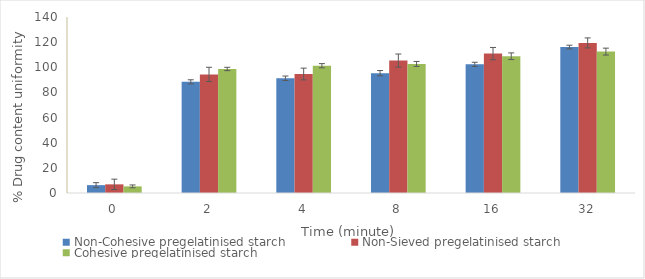
| Category | Non-Cohesive pregelatinised starch | Non-Sieved pregelatinised starch | Cohesive pregelatinised starch |
|---|---|---|---|
| 0.0 | 6.25 | 6.88 | 5.28 |
| 2.0 | 88.4 | 94.34 | 98.66 |
| 4.0 | 91.26 | 94.67 | 101.24 |
| 8.0 | 95.33 | 105.33 | 102.68 |
| 16.0 | 102.34 | 110.88 | 108.79 |
| 32.0 | 116.11 | 119.38 | 112.48 |